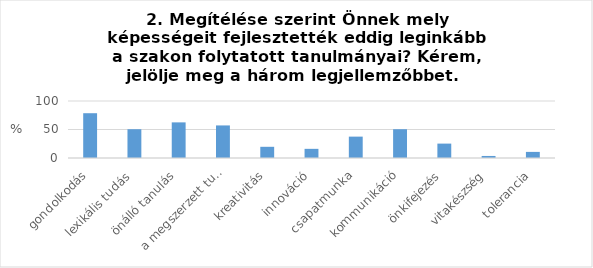
| Category | Series 0 |
|---|---|
| gondolkodás | 78.57 |
| lexikális tudás | 50.5 |
| önálló tanulás | 62.5 |
| a megszerzett tudás alkalmazása | 57.14 |
| kreativitás | 19.64 |
| innováció | 16.07 |
| csapatmunka | 37.5 |
| kommunikáció | 50.5 |
| önkifejezés | 25.25 |
| vitakészség | 3.57 |
| tolerancia | 10.71 |